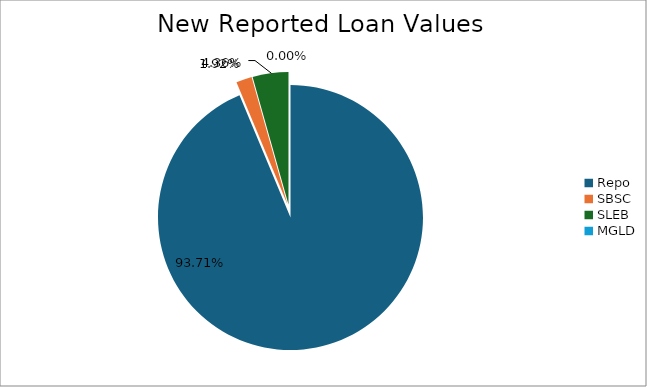
| Category | Series 0 |
|---|---|
| Repo | 11513681.509 |
| SBSC | 236440.902 |
| SLEB | 536206.404 |
| MGLD | 153.98 |